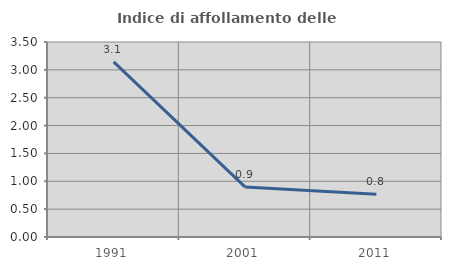
| Category | Indice di affollamento delle abitazioni  |
|---|---|
| 1991.0 | 3.143 |
| 2001.0 | 0.899 |
| 2011.0 | 0.765 |